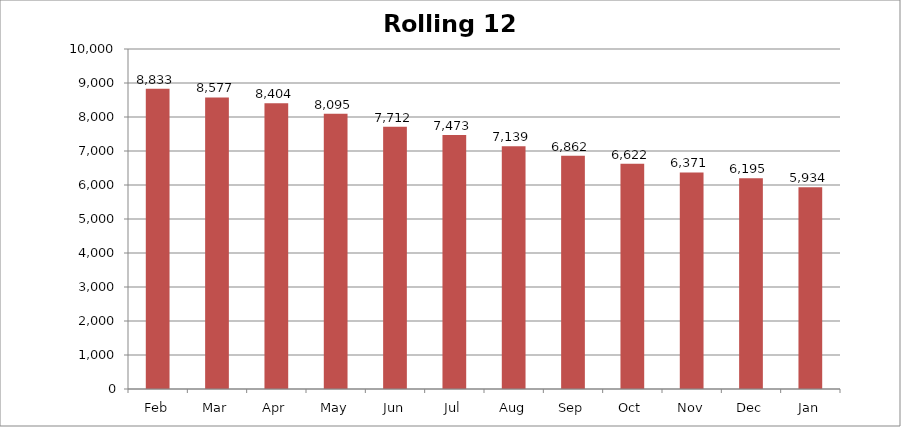
| Category | Rolling 12 Month |
|---|---|
| Feb | 8833 |
| Mar | 8577 |
| Apr | 8404 |
| May | 8095 |
| Jun | 7712 |
| Jul | 7473 |
| Aug | 7139 |
| Sep | 6862 |
| Oct | 6622 |
| Nov | 6371 |
| Dec | 6195 |
| Jan | 5934 |